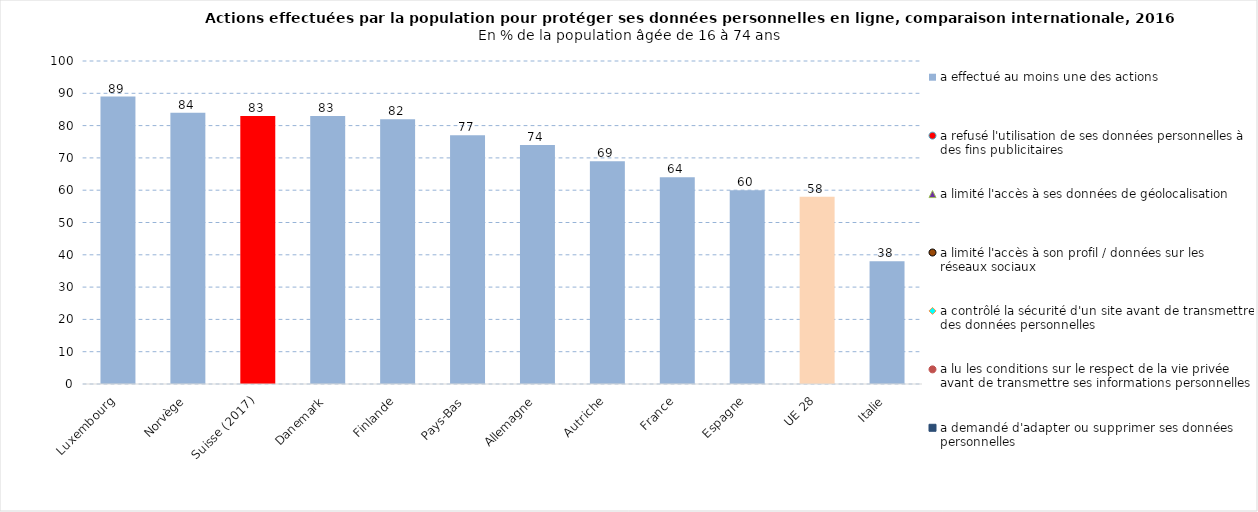
| Category | a effectué au moins une des actions |
|---|---|
| Luxembourg | 89 |
| Norvège | 84 |
| Suisse (2017) | 83 |
| Danemark | 83 |
| Finlande | 82 |
| Pays-Bas | 77 |
| Allemagne | 74 |
| Autriche | 69 |
| France | 64 |
| Espagne | 60 |
| UE 28 | 58 |
| Italie | 38 |